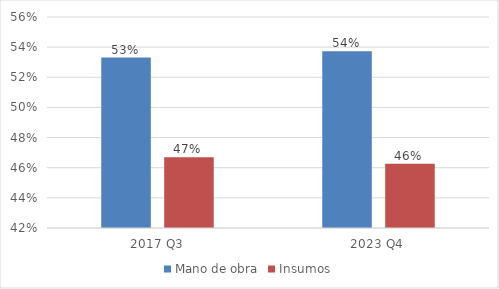
| Category | Mano de obra | Insumos |
|---|---|---|
| 2017 Q3 | 0.533 | 0.467 |
| 2023 Q4 | 0.537 | 0.463 |